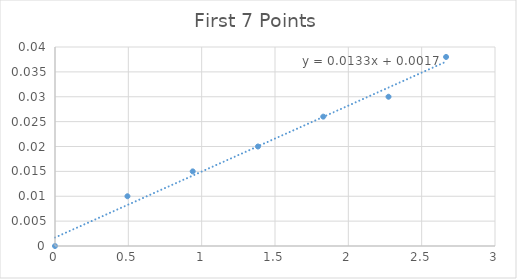
| Category | Series 0 |
|---|---|
| 0.0 | 0 |
| 0.49403159999999996 | 0.01 |
| 0.9390132 | 0.015 |
| 1.3839948 | 0.02 |
| 1.8289764 | 0.026 |
| 2.2739580000000004 | 0.03 |
| 2.666358 | 0.038 |